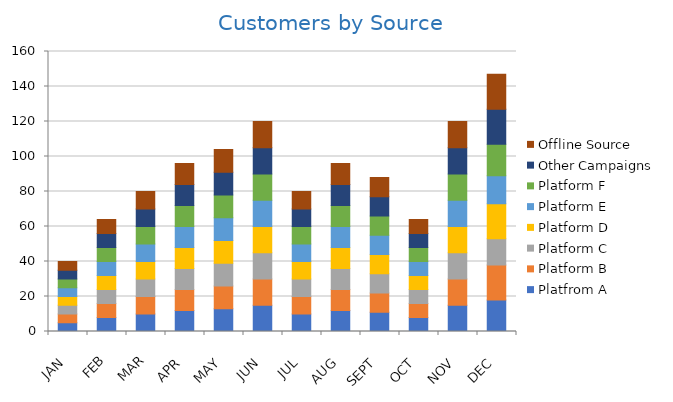
| Category | Platfrom A | Platform B | Platform C | Platform D | Platform E | Platform F | Other Campaigns | Offline Source |
|---|---|---|---|---|---|---|---|---|
| JAN | 5 | 5 | 5 | 5 | 5 | 5 | 5 | 5 |
| FEB | 8 | 8 | 8 | 8 | 8 | 8 | 8 | 8 |
| MAR | 10 | 10 | 10 | 10 | 10 | 10 | 10 | 10 |
| APR | 12 | 12 | 12 | 12 | 12 | 12 | 12 | 12 |
| MAY | 13 | 13 | 13 | 13 | 13 | 13 | 13 | 13 |
| JUN | 15 | 15 | 15 | 15 | 15 | 15 | 15 | 15 |
| JUL | 10 | 10 | 10 | 10 | 10 | 10 | 10 | 10 |
| AUG | 12 | 12 | 12 | 12 | 12 | 12 | 12 | 12 |
| SEPT | 11 | 11 | 11 | 11 | 11 | 11 | 11 | 11 |
| OCT | 8 | 8 | 8 | 8 | 8 | 8 | 8 | 8 |
| NOV | 15 | 15 | 15 | 15 | 15 | 15 | 15 | 15 |
| DEC | 18 | 20 | 15 | 20 | 16 | 18 | 20 | 20 |